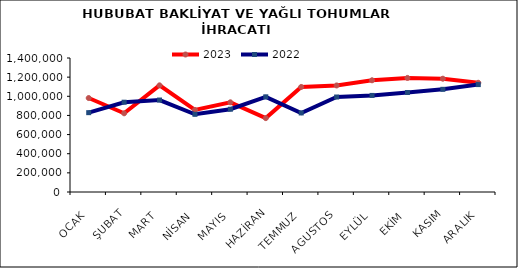
| Category | 2023 | 2022 |
|---|---|---|
| OCAK | 981698.037 | 828945.51 |
| ŞUBAT | 822151.674 | 938089.452 |
| MART | 1114317.132 | 960869.578 |
| NİSAN | 857032.334 | 811604.116 |
| MAYIS | 937003.946 | 864789.173 |
| HAZİRAN | 771977.672 | 994387.134 |
| TEMMUZ | 1097617.653 | 825888.833 |
| AGUSTOS | 1113157.133 | 992365.792 |
| EYLÜL | 1167207.161 | 1008996.633 |
| EKİM | 1192003.904 | 1039700.788 |
| KASIM | 1183537.612 | 1072880.194 |
| ARALIK | 1140967.85 | 1122200.535 |